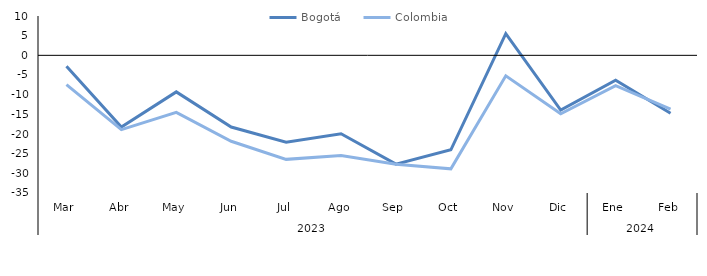
| Category | Bogotá | Colombia |
|---|---|---|
| 0 | -2.789 | -7.436 |
| 1 | -18.237 | -18.881 |
| 2 | -9.295 | -14.517 |
| 3 | -18.229 | -21.848 |
| 4 | -22.08 | -26.448 |
| 5 | -19.922 | -25.454 |
| 6 | -27.65 | -27.71 |
| 7 | -24.019 | -28.863 |
| 8 | 5.5 | -5.219 |
| 9 | -13.929 | -14.877 |
| 10 | -6.323 | -7.694 |
| 11 | -14.703 | -13.691 |